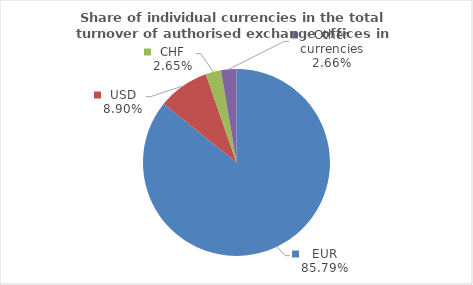
| Category | Series 0 |
|---|---|
| EUR | 85.788 |
| USD | 8.902 |
| CHF | 2.65 |
| Other currencies | 2.661 |